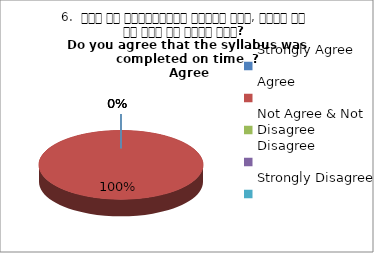
| Category | 6.  समय पर पाठ्यक्रम पूर्ण हुआ, क्या आप इस बात से सहमत हैं? 
Do you agree that the syllabus was completed on time  ?
 Agree |
|---|---|
| Strongly Agree | 0 |
| Agree | 1 |
| Not Agree & Not Disagree | 0 |
| Disagree | 0 |
| Strongly Disagree | 0 |